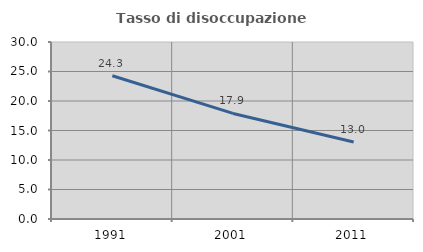
| Category | Tasso di disoccupazione giovanile  |
|---|---|
| 1991.0 | 24.286 |
| 2001.0 | 17.895 |
| 2011.0 | 13.043 |